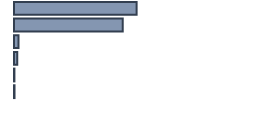
| Category | Percentatge |
|---|---|
| 0 | 51.087 |
| 1 | 45.304 |
| 2 | 1.87 |
| 3 | 1.348 |
| 4 | 0.174 |
| 5 | 0.217 |